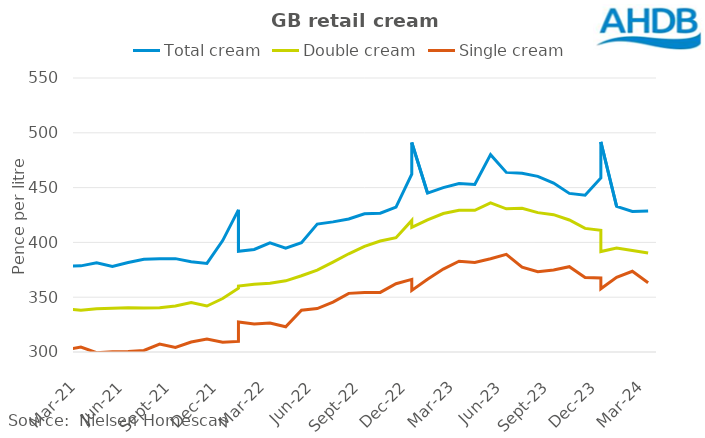
| Category | Total cream | Double cream | Single cream |
|---|---|---|---|
| 2020-08-15 | 391.2 | 346.25 | 321.36 |
| 2020-09-12 | 388.55 | 349.54 | 312.02 |
| 2020-10-10 | 383.4 | 347.28 | 315.07 |
| 2020-11-07 | 384.11 | 347.49 | 312.62 |
| 2020-12-05 | 398.21 | 349.83 | 310.33 |
| 2021-01-02 | 410.21 | 343.2 | 304.49 |
| 2021-01-30 | 378.47 | 341.04 | 303.62 |
| 2021-02-27 | 378.11 | 339.41 | 301.75 |
| 2021-03-27 | 378.6 | 338 | 304.46 |
| 2021-04-24 | 381.49 | 339.42 | 299.41 |
| 2021-05-22 | 378.06 | 340.01 | 300.2 |
| 2021-06-19 | 381.59 | 340.45 | 300.4 |
| 2021-07-17 | 384.59 | 340.21 | 301.4 |
| 2021-08-14 | 385.13 | 340.41 | 307.29 |
| 2021-09-11 | 385.19 | 341.95 | 304.08 |
| 2021-10-09 | 382.42 | 345.16 | 309.07 |
| 2021-11-06 | 380.86 | 341.93 | 311.93 |
| 2021-12-04 | 401.65 | 348.76 | 308.92 |
| 2022-01-01 | 429.71 | 358.14 | 309.68 |
| 2022-01-29 | 391.88 | 360.18 | 327.4 |
| 2022-02-26 | 393.59 | 361.82 | 325.48 |
| 2022-03-26 | 399.68 | 362.8 | 326.49 |
| 2022-04-23 | 394.7 | 364.96 | 323.03 |
| 2022-05-21 | 399.75 | 369.57 | 338.18 |
| 2022-06-18 | 416.72 | 374.77 | 339.59 |
| 2022-07-16 | 418.72 | 382.07 | 345.58 |
| 2022-08-13 | 421.32 | 389.63 | 353.49 |
| 2022-09-10 | 426.06 | 396.32 | 354.36 |
| 2022-10-08 | 426.62 | 401.3 | 354.38 |
| 2022-11-05 | 432.19 | 404.33 | 362.33 |
| 2022-12-03 | 462.33 | 420.05 | 366.22 |
| 2022-12-31 | 491.12 | 413.64 | 356.19 |
| 2023-01-28 | 445.01 | 420.57 | 366.28 |
| 2023-02-25 | 449.95 | 426.36 | 375.66 |
| 2023-03-25 | 453.76 | 429.23 | 382.78 |
| 2023-04-22 | 452.82 | 429.23 | 381.68 |
| 2023-05-20 | 480.08 | 436.04 | 385.04 |
| 2023-06-17 | 463.87 | 430.65 | 389.05 |
| 2023-07-15 | 463.08 | 431.07 | 377.37 |
| 2023-08-12 | 460.22 | 427.16 | 373.23 |
| 2023-09-09 | 454.13 | 425.32 | 374.78 |
| 2023-10-07 | 444.71 | 420.45 | 377.84 |
| 2023-11-04 | 443 | 412.8 | 368.05 |
| 2023-12-02 | 458.83 | 410.97 | 367.46 |
| 2023-12-30 | 491.68 | 391.68 | 357.66 |
| 2024-01-27 | 432.86 | 394.96 | 368.18 |
| 2024-02-24 | 428.22 | 392.53 | 373.69 |
| 2024-03-23 | 428.71 | 390.24 | 363.18 |